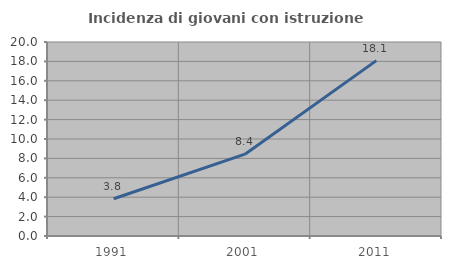
| Category | Incidenza di giovani con istruzione universitaria |
|---|---|
| 1991.0 | 3.841 |
| 2001.0 | 8.435 |
| 2011.0 | 18.081 |